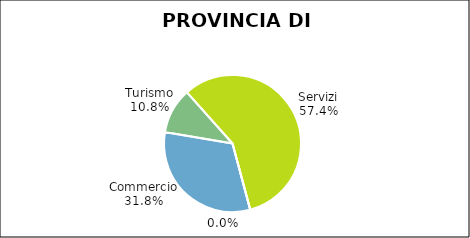
| Category | Provincia di Varese |
|---|---|
| Commercio | 19600 |
| Turismo | 6629 |
| Servizi | 35350 |